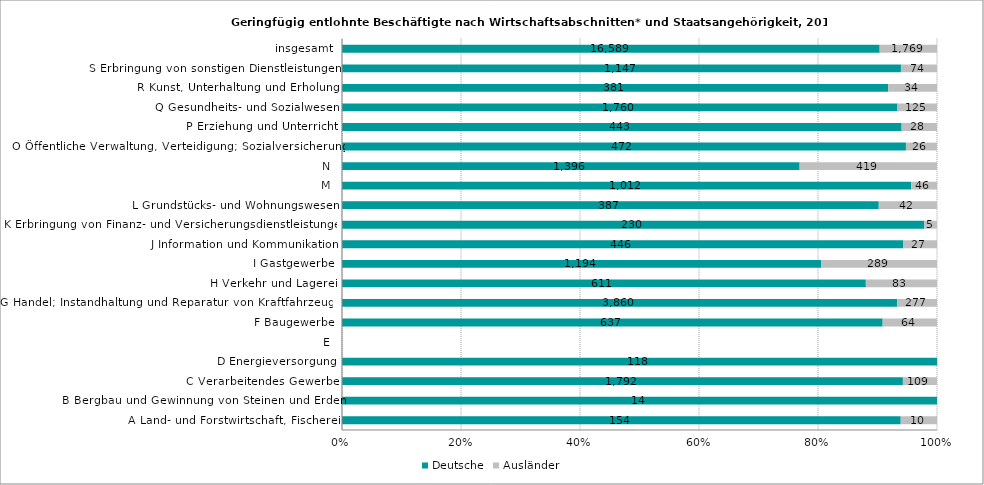
| Category | Deutsche | Ausländer |
|---|---|---|
| A Land- und Forstwirtschaft, Fischerei | 154 | 10 |
| B Bergbau und Gewinnung von Steinen und Erden | 14 | 0 |
| C Verarbeitendes Gewerbe | 1792 | 109 |
| D Energieversorgung | 118 | 0 |
| E | 0 | 0 |
| F Baugewerbe | 637 | 64 |
| G Handel; Instandhaltung und Reparatur von Kraftfahrzeugen | 3860 | 277 |
| H Verkehr und Lagerei | 611 | 83 |
| I Gastgewerbe | 1194 | 289 |
| J Information und Kommunikation | 446 | 27 |
| K Erbringung von Finanz- und Versicherungsdienstleistungen | 230 | 5 |
| L Grundstücks- und Wohnungswesen | 387 | 42 |
| M | 1012 | 46 |
| N | 1396 | 419 |
| O Öffentliche Verwaltung, Verteidigung; Sozialversicherung | 472 | 26 |
| P Erziehung und Unterricht | 443 | 28 |
| Q Gesundheits- und Sozialwesen | 1760 | 125 |
| R Kunst, Unterhaltung und Erholung | 381 | 34 |
| S Erbringung von sonstigen Dienstleistungen | 1147 | 74 |
| insgesamt | 16589 | 1769 |